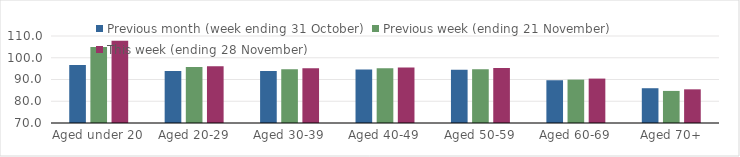
| Category | Previous month (week ending 31 October) | Previous week (ending 21 November) | This week (ending 28 November) |
|---|---|---|---|
| Aged under 20 | 96.65 | 104.98 | 107.8 |
| Aged 20-29 | 93.93 | 95.78 | 96.14 |
| Aged 30-39 | 93.96 | 94.72 | 95.18 |
| Aged 40-49 | 94.61 | 95.12 | 95.47 |
| Aged 50-59 | 94.45 | 94.69 | 95.23 |
| Aged 60-69 | 89.66 | 89.95 | 90.42 |
| Aged 70+ | 85.99 | 84.75 | 85.48 |